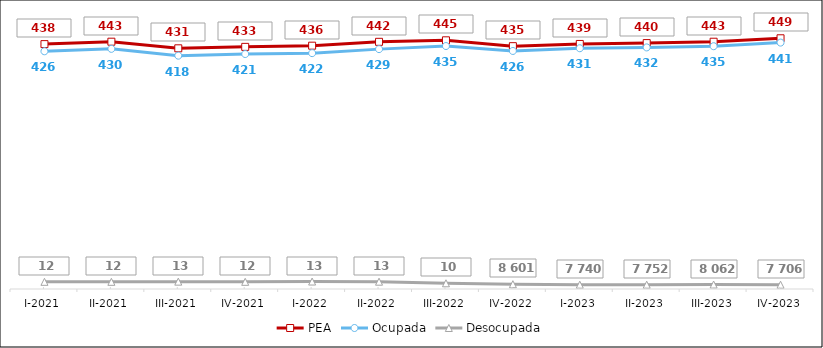
| Category |  PEA  |  Ocupada  |  Desocupada  |
|---|---|---|---|
| I-2021 | 438863 | 426020 | 12843 |
| II-2021 | 443205 | 430373 | 12832 |
| III-2021 | 431338 | 418152 | 13186 |
| IV-2021 | 433926 | 421100 | 12826 |
| I-2022 | 436070 | 422691 | 13379 |
| II-2022 | 442962 | 429880 | 13082 |
| III-2022 | 445659 | 435419 | 10240 |
| IV-2022 | 435183 | 426582 | 8601 |
| I-2023 | 439175 | 431435 | 7740 |
| II-2023 | 440693 | 432941 | 7752 |
| III-2023 | 443151 | 435089 | 8062 |
| IV-2023 | 449300 | 441594 | 7706 |